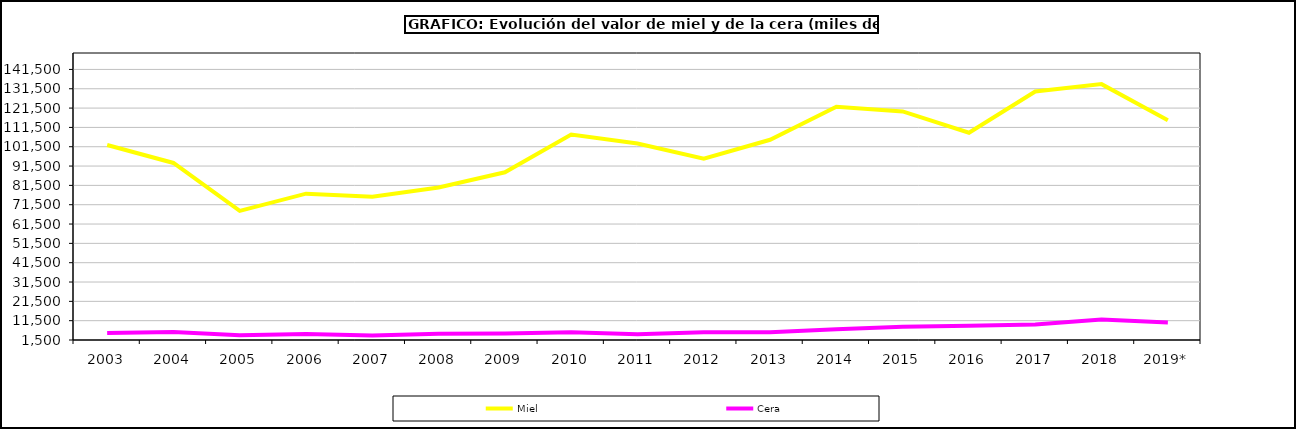
| Category | Miel | Cera |
|---|---|---|
| 2003 | 102378.509 | 5174.836 |
| 2004 | 93106.002 | 5610.186 |
| 2005 | 68333.193 | 3903.341 |
| 2006 | 77210.535 | 4545.79 |
| 2007 | 75671.047 | 3782.043 |
| 2008 | 80408.918 | 4776.982 |
| 2009 | 88291.438 | 4877.522 |
| 2010 | 107827.095 | 5514.256 |
| 2011 | 103137.845 | 4533.385 |
| 2012 | 95366.296 | 5543.637 |
| 2013 | 105102.791 | 5553.321 |
| 2014 | 122217.175 | 7026.714 |
| 2015 | 119753.033 | 8392.273 |
| 2016 | 108750.281 | 8900.258 |
| 2017 | 130055.688 | 9514.815 |
| 2018 | 133889.869 | 12109.137 |
| 2019* | 115176.953 | 10494.018 |